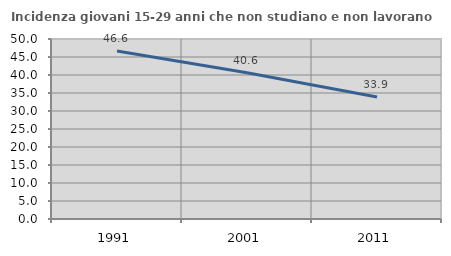
| Category | Incidenza giovani 15-29 anni che non studiano e non lavorano  |
|---|---|
| 1991.0 | 46.639 |
| 2001.0 | 40.625 |
| 2011.0 | 33.914 |